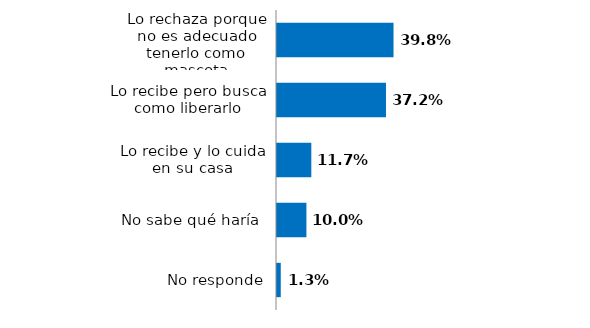
| Category | Series 0 |
|---|---|
| No responde | 0.013 |
| No sabe qué haría  | 0.1 |
| Lo recibe y lo cuida en su casa | 0.117 |
| Lo recibe pero busca como liberarlo | 0.372 |
| Lo rechaza porque no es adecuado tenerlo como mascota | 0.398 |